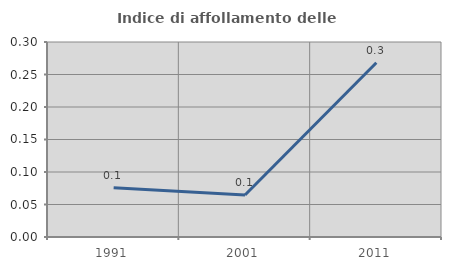
| Category | Indice di affollamento delle abitazioni  |
|---|---|
| 1991.0 | 0.076 |
| 2001.0 | 0.065 |
| 2011.0 | 0.268 |